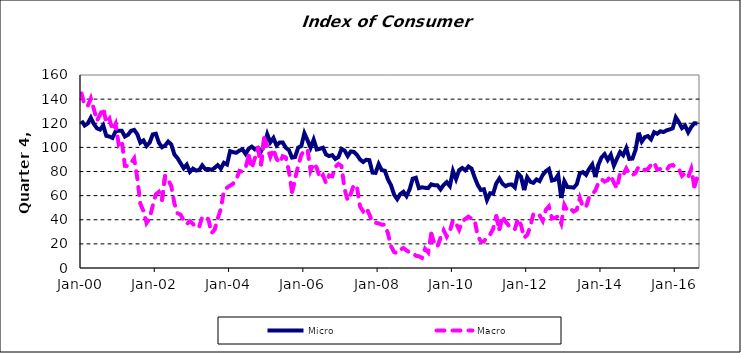
| Category | Micro | Macro |
|---|---|---|
| 2000-01-01 | 122.033 | 144.671 |
| 2000-02-01 | 118.105 | 134.882 |
| 2000-03-01 | 119.819 | 134.325 |
| 2000-04-01 | 124.551 | 140.55 |
| 2000-05-01 | 119.33 | 131.571 |
| 2000-06-01 | 115.783 | 122.098 |
| 2000-07-01 | 114.74 | 127.298 |
| 2000-08-01 | 118.335 | 132.499 |
| 2000-09-01 | 109.575 | 120.543 |
| 2000-10-01 | 108.971 | 123.829 |
| 2000-11-01 | 107.802 | 114.338 |
| 2000-12-01 | 113.366 | 119.46 |
| 2001-01-01 | 113.773 | 102.534 |
| 2001-02-01 | 113.735 | 105.651 |
| 2001-03-01 | 109.015 | 84.703 |
| 2001-04-01 | 110.436 | 84.473 |
| 2001-05-01 | 113.736 | 87.118 |
| 2001-06-01 | 114.486 | 90.818 |
| 2001-07-01 | 111.012 | 74.775 |
| 2001-08-01 | 103.878 | 53.261 |
| 2001-09-01 | 105.741 | 47.234 |
| 2001-10-01 | 101.178 | 37.34 |
| 2001-11-01 | 103.907 | 41.117 |
| 2001-12-01 | 110.732 | 51.622 |
| 2002-01-01 | 111.298 | 61.037 |
| 2002-02-01 | 103.823 | 63.09 |
| 2002-03-01 | 100.109 | 56.455 |
| 2002-04-01 | 101.571 | 76.317 |
| 2002-05-01 | 104.795 | 73.11 |
| 2002-06-01 | 102.425 | 67.887 |
| 2002-07-01 | 94.159 | 53.502 |
| 2002-08-01 | 91.072 | 45.419 |
| 2002-09-01 | 86.917 | 44.204 |
| 2002-10-01 | 82.722 | 39.545 |
| 2002-11-01 | 85.689 | 36.343 |
| 2002-12-01 | 79.713 | 38.753 |
| 2003-01-01 | 82.388 | 36.577 |
| 2003-02-01 | 80.847 | 33.369 |
| 2003-03-01 | 81.115 | 34.031 |
| 2003-04-01 | 85.079 | 42.287 |
| 2003-05-01 | 81.866 | 42.539 |
| 2003-06-01 | 82.117 | 40.282 |
| 2003-07-01 | 81.338 | 28.837 |
| 2003-08-01 | 82.985 | 31.817 |
| 2003-09-01 | 85.27 | 40.978 |
| 2003-10-01 | 82.466 | 48.873 |
| 2003-11-01 | 87.201 | 64.199 |
| 2003-12-01 | 85.816 | 66.62 |
| 2004-01-01 | 96.832 | 68.309 |
| 2004-02-01 | 95.966 | 69.934 |
| 2004-03-01 | 95.537 | 73.372 |
| 2004-04-01 | 97.339 | 80.474 |
| 2004-05-01 | 98.249 | 79.815 |
| 2004-06-01 | 94.528 | 83.165 |
| 2004-07-01 | 98.869 | 93.011 |
| 2004-08-01 | 100.572 | 82.665 |
| 2004-09-01 | 98.328 | 90.996 |
| 2004-10-01 | 99.702 | 99.46 |
| 2004-11-01 | 96.854 | 85.949 |
| 2004-12-01 | 101.457 | 107.618 |
| 2005-01-01 | 110.889 | 100.362 |
| 2005-02-01 | 104.199 | 92.201 |
| 2005-03-01 | 107.819 | 98.654 |
| 2005-04-01 | 101.622 | 90.447 |
| 2005-05-01 | 103.977 | 87.074 |
| 2005-06-01 | 104.029 | 92.703 |
| 2005-07-01 | 99.703 | 91.564 |
| 2005-08-01 | 97.814 | 80.315 |
| 2005-09-01 | 91.518 | 63.251 |
| 2005-10-01 | 92.015 | 73.91 |
| 2005-11-01 | 99.86 | 84.733 |
| 2005-12-01 | 101.062 | 93.832 |
| 2006-01-01 | 111.716 | 97.487 |
| 2006-02-01 | 105.951 | 98.115 |
| 2006-03-01 | 99.751 | 80.696 |
| 2006-04-01 | 106.433 | 86.913 |
| 2006-05-01 | 98.219 | 83.055 |
| 2006-06-01 | 98.819 | 74.517 |
| 2006-07-01 | 99.681 | 77.025 |
| 2006-08-01 | 94.061 | 70.371 |
| 2006-09-01 | 92.803 | 76.745 |
| 2006-10-01 | 93.565 | 75.992 |
| 2006-11-01 | 90.419 | 83.849 |
| 2006-12-01 | 91.975 | 86.292 |
| 2007-01-01 | 98.727 | 84.465 |
| 2007-02-01 | 97.397 | 65.219 |
| 2007-03-01 | 92.868 | 56.066 |
| 2007-04-01 | 96.613 | 61.673 |
| 2007-05-01 | 96.293 | 69.187 |
| 2007-06-01 | 93.701 | 66.663 |
| 2007-07-01 | 89.885 | 50.902 |
| 2007-08-01 | 87.895 | 47.023 |
| 2007-09-01 | 89.772 | 49.961 |
| 2007-10-01 | 89.38 | 44.383 |
| 2007-11-01 | 79.107 | 37.98 |
| 2007-12-01 | 78.83 | 37.396 |
| 2008-01-01 | 86.152 | 37.032 |
| 2008-02-01 | 81.158 | 35.843 |
| 2008-03-01 | 80.614 | 36.057 |
| 2008-04-01 | 73.365 | 28.709 |
| 2008-05-01 | 68.532 | 17.924 |
| 2008-06-01 | 60.753 | 13.212 |
| 2008-07-01 | 57.067 | 12.218 |
| 2008-08-01 | 61.362 | 15.19 |
| 2008-09-01 | 63.182 | 16.573 |
| 2008-10-01 | 59.597 | 14.509 |
| 2008-11-01 | 65.044 | 13.008 |
| 2008-12-01 | 74.037 | 12.732 |
| 2009-01-01 | 74.813 | 10.148 |
| 2009-02-01 | 66.234 | 9.687 |
| 2009-03-01 | 66.914 | 8.374 |
| 2009-04-01 | 66.462 | 15.929 |
| 2009-05-01 | 66.249 | 12.941 |
| 2009-06-01 | 69.369 | 28.367 |
| 2009-07-01 | 68.562 | 19.654 |
| 2009-08-01 | 68.508 | 17.736 |
| 2009-09-01 | 65.205 | 25.189 |
| 2009-10-01 | 68.847 | 31.248 |
| 2009-11-01 | 71.206 | 25.965 |
| 2009-12-01 | 67.933 | 30.464 |
| 2010-01-01 | 80.46 | 39.698 |
| 2010-02-01 | 73.762 | 36.857 |
| 2010-03-01 | 81.099 | 31.728 |
| 2010-04-01 | 82.921 | 38.543 |
| 2010-05-01 | 80.948 | 40.752 |
| 2010-06-01 | 84.12 | 42.589 |
| 2010-07-01 | 82.416 | 40.833 |
| 2010-08-01 | 75.19 | 39.865 |
| 2010-09-01 | 68.892 | 26.5 |
| 2010-10-01 | 64.678 | 22.114 |
| 2010-11-01 | 65.258 | 21.902 |
| 2010-12-01 | 56.36 | 25.595 |
| 2011-01-01 | 61.969 | 27.799 |
| 2011-02-01 | 61.673 | 32.47 |
| 2011-03-01 | 70.177 | 42.848 |
| 2011-04-01 | 74.165 | 32.312 |
| 2011-05-01 | 69.918 | 42.834 |
| 2011-06-01 | 67.815 | 38.389 |
| 2011-07-01 | 69.069 | 35.273 |
| 2011-08-01 | 69.234 | 34.831 |
| 2011-09-01 | 66.786 | 32.117 |
| 2011-10-01 | 78.388 | 40.8 |
| 2011-11-01 | 75.704 | 35.595 |
| 2011-12-01 | 64.555 | 25.16 |
| 2012-01-01 | 75.184 | 27.369 |
| 2012-02-01 | 71.453 | 34.446 |
| 2012-03-01 | 70.595 | 44.932 |
| 2012-04-01 | 73.447 | 45.431 |
| 2012-05-01 | 71.993 | 43.675 |
| 2012-06-01 | 77.136 | 39.087 |
| 2012-07-01 | 80.219 | 48.144 |
| 2012-08-01 | 82.064 | 51.026 |
| 2012-09-01 | 72.491 | 41.041 |
| 2012-10-01 | 73.184 | 41.57 |
| 2012-11-01 | 77.116 | 42.83 |
| 2012-12-01 | 58.007 | 36.826 |
| 2013-01-01 | 71.927 | 52.222 |
| 2013-02-01 | 67.059 | 47.322 |
| 2013-03-01 | 67.025 | 48.915 |
| 2013-04-01 | 66.604 | 46.767 |
| 2013-05-01 | 69.425 | 48.305 |
| 2013-06-01 | 78.546 | 58.062 |
| 2013-07-01 | 79.477 | 50.626 |
| 2013-08-01 | 77.21 | 50.537 |
| 2013-09-01 | 82.198 | 58.731 |
| 2013-10-01 | 85.8 | 61.229 |
| 2013-11-01 | 75.397 | 64.171 |
| 2013-12-01 | 85.658 | 70.563 |
| 2014-01-01 | 91.696 | 73.432 |
| 2014-02-01 | 94.349 | 71.59 |
| 2014-03-01 | 89.573 | 72.863 |
| 2014-04-01 | 93.851 | 76.847 |
| 2014-05-01 | 84.933 | 70.696 |
| 2014-06-01 | 90.66 | 66.036 |
| 2014-07-01 | 96.09 | 78.863 |
| 2014-08-01 | 93.547 | 77.04 |
| 2014-09-01 | 99.374 | 82.468 |
| 2014-10-01 | 90.433 | 77.852 |
| 2014-11-01 | 90.718 | 76.926 |
| 2014-12-01 | 97.916 | 78.77 |
| 2015-01-01 | 112.11 | 83.893 |
| 2015-02-01 | 104.773 | 82.509 |
| 2015-03-01 | 108.482 | 81.126 |
| 2015-04-01 | 109.378 | 82.069 |
| 2015-05-01 | 106.713 | 85.52 |
| 2015-06-01 | 112.594 | 87.557 |
| 2015-07-01 | 111.305 | 81.482 |
| 2015-08-01 | 113.343 | 82.014 |
| 2015-09-01 | 112.684 | 81.792 |
| 2015-10-01 | 114.077 | 81.192 |
| 2015-11-01 | 114.85 | 84.711 |
| 2015-12-01 | 115.748 | 85.413 |
| 2016-01-01 | 124.905 | 83.115 |
| 2016-02-01 | 120.897 | 82.05 |
| 2016-03-01 | 115.972 | 76.426 |
| 2016-04-01 | 118.044 | 78.696 |
| 2016-05-01 | 112.483 | 75.465 |
| 2016-06-01 | 116.907 | 82.208 |
| 2016-07-01 | 120.018 | 67.706 |
| 2016-08-01 | 119.781 | 75.928 |